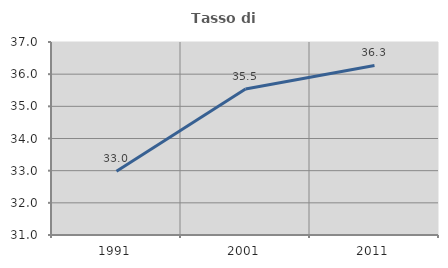
| Category | Tasso di occupazione   |
|---|---|
| 1991.0 | 32.984 |
| 2001.0 | 35.536 |
| 2011.0 | 36.27 |